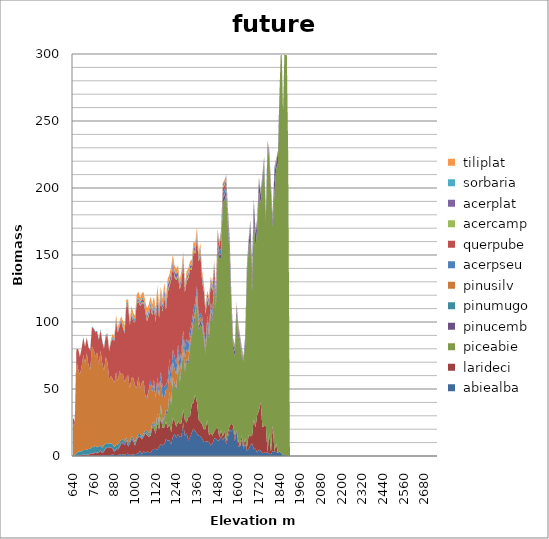
| Category |  abiealba |  larideci |  piceabie |  pinucemb |  pinumugo |  pinusilv |  acerpseu |  querpube |  acercamp |  acerplat |  sorbaria |  tiliplat |
|---|---|---|---|---|---|---|---|---|---|---|---|---|
| 640.0 | 0 | 0 | 0 | 0 | 0.323 | 23.474 | 0 | 4.704 | 0 | 0 | 0 | 0 |
| 650.0 | 0 | 0 | 0 | 0 | 0.431 | 22.198 | 0 | 3.252 | 0 | 0 | 0 | 0 |
| 660.0 | 0 | 0.091 | 0 | 0 | 2.044 | 68.238 | 0 | 9.557 | 0 | 0 | 0.005 | 0 |
| 670.0 | 0.007 | 0.401 | 0 | 0.013 | 2.715 | 61.76 | 0 | 14.93 | 0.001 | 0 | 0.104 | 0 |
| 680.0 | 0.008 | 0.586 | 0 | 0.011 | 2.964 | 57.024 | 0 | 13.486 | 0 | 0 | 0.146 | 0 |
| 690.0 | 0.024 | 0.575 | 0 | 0.051 | 2.938 | 63.038 | 0 | 13.546 | 0 | 0 | 0.21 | 0 |
| 700.0 | 0.081 | 1.008 | 0 | 0.126 | 3.188 | 70.913 | 0 | 12.954 | 0 | 0 | 0.324 | 0.002 |
| 710.0 | 0.063 | 0.841 | 0 | 0.088 | 3.44 | 64.424 | 0 | 12.69 | 0 | 0 | 0.267 | 0 |
| 720.0 | 0.097 | 0.638 | 0 | 0.147 | 4.031 | 72.02 | 0 | 11.426 | 0.001 | 0 | 0.41 | 0 |
| 730.0 | 0.155 | 0.925 | 0 | 0.208 | 3.935 | 62.399 | 0 | 13.411 | 0 | 0.001 | 0.425 | 0.001 |
| 740.0 | 0.179 | 1.336 | 0 | 0.22 | 3.732 | 58.757 | 0 | 14.437 | 0 | 0.001 | 0.518 | 0.002 |
| 750.0 | 0.218 | 1.769 | 0 | 0.275 | 4.629 | 74.861 | 0 | 14.465 | 0 | 0 | 0.627 | 0.001 |
| 760.0 | 0.19 | 1.498 | 0 | 0.24 | 4.589 | 72.752 | 0 | 15.649 | 0.003 | 0.001 | 0.628 | 0.006 |
| 770.0 | 0.209 | 2.584 | 0 | 0.352 | 4.723 | 66.568 | 0 | 17.869 | 0.004 | 0.006 | 0.701 | 0.013 |
| 780.0 | 0.218 | 1.824 | 0 | 0.276 | 4.208 | 70.791 | 0 | 15.324 | 0.004 | 0.002 | 0.747 | 0.008 |
| 790.0 | 0.212 | 2.452 | 0 | 0.357 | 3.902 | 61.228 | 0 | 18.566 | 0.009 | 0.007 | 0.742 | 0.017 |
| 800.0 | 0.259 | 3.532 | 0 | 0.337 | 4.083 | 70.594 | 0 | 15.005 | 0.01 | 0.011 | 0.926 | 0.024 |
| 810.0 | 0.223 | 1.793 | 0 | 0.362 | 3.763 | 63.028 | 0 | 16.107 | 0.013 | 0.008 | 0.983 | 0.041 |
| 820.0 | 0.506 | 2.865 | 0 | 0.592 | 4.208 | 55.599 | 0 | 16.298 | 0.031 | 0.035 | 1.099 | 0.133 |
| 830.0 | 0.615 | 4.883 | 0 | 0.554 | 3.256 | 64.451 | 0 | 15.319 | 0.079 | 0.046 | 1.099 | 0.333 |
| 840.0 | 0.694 | 5.426 | 0 | 0.615 | 2.901 | 60.718 | 0 | 19.197 | 0.112 | 0.281 | 1.047 | 0.896 |
| 850.0 | 0.44 | 5.392 | 0 | 0.465 | 3.051 | 47.9 | 0 | 20.957 | 0.098 | 0.137 | 0.937 | 1.097 |
| 860.0 | 0.75 | 5.623 | 0 | 0.42 | 2.735 | 50.194 | 0 | 25.283 | 0.095 | 0.131 | 0.819 | 0.897 |
| 870.0 | 1.096 | 4.146 | 0 | 0.543 | 3.027 | 48.718 | 0 | 29.504 | 0.155 | 0.312 | 0.954 | 2.708 |
| 880.0 | 0.753 | 1.978 | 0 | 0.686 | 3.399 | 47.326 | 0 | 31.762 | 0.224 | 0.28 | 0.98 | 1.522 |
| 890.0 | 0.739 | 4.156 | 0 | 0.564 | 2.822 | 54.316 | 0 | 38.095 | 0.272 | 0.435 | 1 | 2.904 |
| 900.0 | 0.738 | 3.595 | 0 | 0.766 | 3.273 | 46.996 | 0 | 36.69 | 0.24 | 0.356 | 1.128 | 2.381 |
| 910.0 | 0.978 | 5.573 | 0 | 0.862 | 2.527 | 53.757 | 0 | 33.021 | 0.326 | 0.705 | 1.02 | 1.631 |
| 920.0 | 1.465 | 7.644 | 0 | 0.814 | 2.751 | 47.793 | 0 | 40.315 | 0.345 | 0.379 | 0.922 | 1.769 |
| 930.0 | 1.205 | 8.202 | 0 | 0.739 | 2.228 | 49.168 | 0 | 33.975 | 0.437 | 0.518 | 0.91 | 3.611 |
| 940.0 | 0.782 | 7.105 | 0.001 | 0.655 | 2.195 | 44.241 | 0 | 36.593 | 0.445 | 0.618 | 1.107 | 3.758 |
| 950.0 | 1.537 | 9.784 | 0.001 | 0.581 | 1.835 | 44.756 | 0 | 53.761 | 0.378 | 0.59 | 0.923 | 2.426 |
| 960.0 | 1.667 | 5.387 | 0.004 | 0.685 | 2.001 | 50.97 | 0.002 | 50.364 | 0.556 | 1.456 | 1.062 | 2.83 |
| 970.0 | 0.8 | 8.032 | 0.001 | 0.649 | 1.742 | 39.252 | 0.003 | 47.322 | 0.358 | 0.635 | 0.923 | 1.785 |
| 980.0 | 0.913 | 11.56 | 0.008 | 0.526 | 1.609 | 43.868 | 0.001 | 46.557 | 0.45 | 1.113 | 1.081 | 4.28 |
| 990.0 | 1.064 | 9.778 | 0.021 | 0.764 | 1.615 | 45.234 | 0.007 | 41.951 | 0.585 | 1.301 | 1.129 | 3.377 |
| 1000.0 | 1.574 | 5.988 | 0.029 | 0.535 | 2.134 | 42.462 | 0.014 | 46.697 | 0.611 | 1.09 | 1.225 | 2.454 |
| 1010.0 | 1.586 | 10.28 | 0.093 | 0.509 | 1.529 | 36.511 | 0.607 | 62.495 | 0.608 | 1.396 | 1.193 | 3.654 |
| 1020.0 | 1.821 | 12.059 | 0.064 | 0.652 | 1.773 | 42.887 | 0.024 | 55.892 | 0.729 | 1.315 | 1.056 | 4.228 |
| 1030.0 | 3.973 | 10.204 | 0.053 | 0.576 | 1.685 | 33.852 | 0.015 | 61.623 | 0.744 | 1.328 | 1.046 | 3.205 |
| 1040.0 | 1.362 | 11.02 | 0.111 | 0.592 | 1.28 | 40.237 | 0.21 | 59.01 | 0.792 | 2.415 | 0.846 | 3.755 |
| 1050.0 | 3.606 | 10.792 | 0.176 | 0.748 | 1.336 | 39.569 | 0.277 | 57.58 | 0.946 | 1.759 | 1.045 | 4.477 |
| 1060.0 | 2.332 | 14.528 | 0.475 | 0.749 | 1.352 | 25.08 | 0.605 | 62.758 | 0.905 | 1.925 | 1.02 | 3.364 |
| 1070.0 | 3.155 | 12.326 | 0.837 | 0.818 | 1.38 | 24.459 | 0.83 | 56.685 | 1.541 | 2.038 | 1.191 | 4.934 |
| 1080.0 | 3.156 | 11.184 | 0.517 | 0.649 | 1.363 | 31.981 | 0.851 | 54.86 | 1.04 | 1.869 | 1.045 | 4.545 |
| 1090.0 | 1.95 | 13.044 | 1.361 | 0.703 | 1.634 | 34.397 | 3.434 | 54.333 | 0.979 | 1.878 | 0.962 | 4.298 |
| 1100.0 | 4.297 | 16.613 | 0.597 | 0.989 | 1.284 | 24.078 | 2.326 | 54.881 | 1.227 | 1.921 | 1.153 | 3.763 |
| 1110.0 | 5.182 | 15.444 | 2.712 | 0.861 | 1.327 | 28.056 | 3.505 | 53.942 | 1.049 | 1.654 | 1.081 | 4.26 |
| 1120.0 | 5.399 | 11.276 | 3.337 | 0.958 | 1.174 | 21.381 | 1.266 | 55.495 | 1.358 | 3.18 | 1.099 | 4.22 |
| 1130.0 | 4.362 | 20.104 | 5.096 | 1.081 | 1.145 | 23.273 | 3.436 | 57.971 | 1.332 | 3.227 | 1.166 | 4.762 |
| 1140.0 | 7.014 | 12.767 | 3.511 | 1.04 | 1.188 | 19.014 | 5.152 | 53.414 | 1.576 | 2.892 | 1.183 | 4.3 |
| 1150.0 | 8.852 | 20.089 | 7.615 | 1.286 | 0.717 | 18.33 | 6.081 | 54.686 | 1.183 | 2.45 | 1.097 | 3.928 |
| 1160.0 | 7.766 | 13.202 | 2.801 | 1.121 | 0.943 | 18.153 | 7.493 | 55.887 | 1.519 | 2.715 | 1.135 | 4.26 |
| 1170.0 | 8.846 | 12.358 | 5.959 | 1.194 | 0.744 | 14.851 | 7.506 | 67.653 | 1.536 | 3.573 | 0.832 | 4.447 |
| 1180.0 | 12.516 | 13.406 | 6.285 | 1.512 | 0.835 | 14.784 | 3.849 | 55.922 | 1.444 | 2.891 | 1.016 | 4.064 |
| 1190.0 | 11.462 | 9.399 | 10.307 | 1.625 | 0.694 | 16.229 | 6.099 | 66.28 | 1.47 | 3.95 | 0.858 | 3.979 |
| 1200.0 | 11.69 | 11.895 | 22.66 | 1.06 | 0.506 | 16.272 | 8.28 | 54.254 | 1.176 | 2.89 | 0.817 | 3.97 |
| 1210.0 | 8.666 | 9.273 | 19.818 | 0.994 | 0.454 | 13.743 | 8.036 | 70.429 | 1.439 | 3.336 | 0.851 | 4.207 |
| 1220.0 | 14.378 | 14.035 | 28.269 | 1.411 | 0.65 | 11.659 | 9.005 | 62.154 | 1.314 | 2.673 | 0.726 | 4.013 |
| 1230.0 | 16.779 | 9.446 | 26.295 | 1.293 | 0.767 | 10.452 | 9.492 | 58.804 | 1.21 | 3.018 | 0.579 | 3.701 |
| 1240.0 | 13.511 | 8.164 | 26.994 | 1.336 | 0.695 | 10.001 | 7.579 | 63.016 | 1.365 | 2.863 | 0.634 | 3.847 |
| 1250.0 | 16.356 | 9.53 | 41.784 | 1.461 | 0.481 | 7.821 | 5.872 | 50.251 | 1.344 | 2.631 | 0.64 | 3.965 |
| 1260.0 | 14.26 | 9.971 | 29.304 | 1.683 | 0.659 | 6.681 | 8.553 | 53.282 | 1.094 | 2.215 | 0.569 | 3.238 |
| 1270.0 | 14.68 | 9.846 | 40.651 | 1.658 | 0.318 | 6.051 | 6.066 | 50.492 | 1.512 | 2.452 | 0.543 | 3.682 |
| 1280.0 | 24.811 | 9.979 | 43.539 | 1.703 | 0.337 | 7.635 | 5.813 | 52.065 | 1.211 | 2.04 | 0.497 | 2.847 |
| 1290.0 | 14.887 | 12.02 | 35.547 | 2.138 | 0.532 | 8.331 | 7.319 | 41.581 | 1.229 | 1.665 | 0.812 | 3.079 |
| 1300.0 | 16.874 | 7.966 | 45.03 | 1.586 | 0.541 | 7.312 | 7.998 | 42.89 | 1.631 | 1.997 | 0.572 | 3.415 |
| 1310.0 | 11.408 | 17.808 | 40.353 | 1.372 | 0.575 | 6.35 | 6.025 | 48.931 | 1.51 | 1.784 | 0.691 | 3.301 |
| 1320.0 | 14.173 | 15.661 | 51.53 | 1.639 | 0.444 | 4.364 | 5.966 | 45.04 | 1.262 | 1.679 | 0.647 | 2.974 |
| 1330.0 | 17.5 | 21.174 | 50.159 | 2.401 | 0.593 | 3.323 | 4.524 | 39.31 | 1.656 | 1.879 | 0.824 | 3.124 |
| 1340.0 | 20.686 | 19.097 | 57.626 | 2.625 | 0.392 | 3.109 | 5.998 | 42.917 | 1.663 | 1.875 | 0.631 | 3.529 |
| 1350.0 | 18.519 | 27.475 | 56.379 | 2.75 | 0.521 | 2.654 | 6.397 | 36.216 | 1.76 | 2.121 | 0.798 | 3.334 |
| 1360.0 | 16.733 | 23.336 | 75.129 | 2.238 | 0.324 | 4.91 | 4.167 | 36.176 | 1.769 | 1.961 | 0.799 | 3.275 |
| 1370.0 | 15.18 | 11.912 | 66.544 | 2.916 | 0.792 | 3.647 | 3.183 | 40.852 | 1.644 | 1.706 | 0.622 | 2.8 |
| 1380.0 | 14.885 | 10.531 | 72.604 | 2.496 | 0.546 | 2.798 | 2.715 | 44.215 | 1.773 | 1.969 | 0.802 | 3.427 |
| 1390.0 | 12.93 | 10.633 | 72.085 | 2.136 | 0.528 | 2.309 | 3.441 | 26.266 | 1.877 | 2.085 | 0.747 | 3.139 |
| 1400.0 | 10.307 | 9.721 | 65.71 | 2.414 | 0.632 | 2.224 | 3.064 | 28.9 | 1.6 | 1.567 | 0.503 | 1.891 |
| 1410.0 | 10.638 | 9.325 | 55.422 | 2.082 | 0.377 | 2.989 | 3.332 | 21.731 | 1.868 | 2.004 | 0.728 | 2.326 |
| 1420.0 | 11.014 | 16.328 | 69.902 | 2.541 | 0.42 | 1.661 | 2.858 | 12.374 | 1.861 | 2.126 | 0.504 | 1.842 |
| 1430.0 | 10.295 | 5.005 | 72.313 | 2.121 | 0.371 | 3.063 | 3.453 | 15.155 | 2.04 | 2.266 | 0.581 | 1.887 |
| 1440.0 | 7.765 | 9.51 | 89.45 | 2.226 | 0.348 | 1.49 | 3.701 | 13.92 | 1.636 | 1.915 | 0.443 | 1.518 |
| 1450.0 | 9.471 | 5.694 | 85.581 | 3.234 | 0.151 | 0.748 | 3.684 | 14.822 | 1.77 | 1.815 | 0.479 | 1.379 |
| 1460.0 | 13.136 | 5.122 | 107.293 | 3.308 | 0.101 | 0.307 | 4.015 | 8.25 | 1.177 | 1.498 | 0.281 | 0.933 |
| 1470.0 | 13.166 | 7.253 | 88.802 | 3.716 | 0.094 | 0.481 | 3.615 | 4.573 | 1.237 | 1.342 | 0.235 | 0.931 |
| 1480.0 | 11.446 | 9.808 | 131.677 | 3.3 | 0.187 | 0.765 | 2.345 | 6.263 | 0.976 | 1.093 | 0.272 | 0.716 |
| 1490.0 | 11.832 | 2.155 | 133.683 | 2.014 | 0.275 | 0.842 | 2.198 | 3.67 | 1.35 | 1.247 | 0.255 | 0.935 |
| 1500.0 | 14.943 | 4.288 | 128.412 | 2.564 | 0.187 | 0.281 | 4.3 | 9.535 | 1.516 | 1.482 | 0.287 | 0.996 |
| 1510.0 | 11.654 | 2.896 | 175.054 | 2.721 | 0.121 | 0.3 | 3.531 | 3.612 | 1.348 | 1.467 | 0.204 | 1.025 |
| 1520.0 | 14.606 | 3.917 | 172.26 | 3.766 | 0.121 | 0.737 | 3.43 | 3.304 | 1.331 | 1.442 | 0.241 | 0.9 |
| 1530.0 | 8.651 | 2.418 | 184.322 | 3.573 | 0.069 | 0.775 | 3.558 | 2.737 | 1.445 | 1.424 | 0.261 | 0.801 |
| 1540.0 | 14.015 | 3.514 | 152.553 | 3.369 | 0.091 | 0.317 | 3.685 | 2.867 | 1.41 | 1.487 | 0.359 | 0.745 |
| 1550.0 | 20.302 | 2.559 | 126.029 | 6.182 | 0.135 | 0.406 | 2.597 | 1.952 | 1.219 | 1.185 | 0.243 | 0.512 |
| 1560.0 | 18.204 | 5.826 | 84.824 | 5.446 | 0.124 | 0.273 | 2.1 | 1.56 | 0.519 | 0.613 | 0.09 | 0.246 |
| 1570.0 | 20.702 | 2.138 | 57.325 | 3.3 | 0.097 | 0.851 | 1.072 | 1.075 | 0.556 | 0.478 | 0.172 | 0.252 |
| 1580.0 | 10.944 | 4.038 | 59.452 | 3.451 | 0.404 | 0.7 | 1.608 | 1.053 | 0.568 | 0.609 | 0.227 | 0.26 |
| 1590.0 | 18.75 | 0.487 | 86.712 | 3.394 | 0.304 | 0.63 | 1.222 | 1.488 | 0.735 | 0.685 | 0.262 | 0.283 |
| 1600.0 | 7.212 | 4.11 | 78.188 | 3.125 | 0.472 | 1.579 | 1.417 | 1.428 | 0.675 | 0.535 | 0.147 | 0.229 |
| 1610.0 | 7.022 | 0.281 | 77.177 | 2.159 | 0.113 | 0.143 | 1.149 | 0.635 | 0.667 | 0.712 | 0.105 | 0.146 |
| 1620.0 | 12.028 | 3.727 | 58.076 | 1.998 | 0.432 | 1.351 | 0.798 | 1.559 | 0.866 | 0.662 | 0.225 | 0.15 |
| 1630.0 | 5.277 | 1.341 | 63.756 | 1.146 | 0.095 | 0.333 | 0.788 | 0.338 | 0.498 | 0.468 | 0.037 | 0.1 |
| 1640.0 | 9.205 | 4.22 | 69.89 | 4.049 | 0.126 | 0.157 | 1.162 | 0.309 | 0.27 | 0.324 | 0.094 | 0.01 |
| 1650.0 | 3.965 | 2.12 | 129.335 | 3.238 | 0.084 | 0.319 | 1.038 | 0.747 | 0.563 | 0.472 | 0.112 | 0.026 |
| 1660.0 | 5.103 | 10.351 | 138.436 | 3.718 | 0.075 | 0.336 | 1.13 | 0.966 | 0.579 | 0.64 | 0.088 | 0.047 |
| 1670.0 | 7.801 | 6.99 | 146.27 | 11.245 | 0 | 0 | 1.853 | 0.592 | 0.788 | 0.609 | 0.088 | 0 |
| 1680.0 | 9.52 | 5.352 | 107.072 | 12.282 | 0.333 | 0.475 | 1.556 | 1.288 | 0.828 | 0.611 | 0.179 | 0 |
| 1690.0 | 5.242 | 22.341 | 150.632 | 10.609 | 0.068 | 0.126 | 1.231 | 0.543 | 0.641 | 0.68 | 0.074 | 0 |
| 1700.0 | 5.425 | 15.918 | 133.68 | 10.494 | 0.099 | 0.19 | 1.556 | 0.654 | 0.589 | 0.57 | 0.134 | 0 |
| 1710.0 | 2.421 | 28.216 | 139.901 | 3.584 | 0.131 | 0.031 | 0.864 | 1.083 | 0.459 | 0.427 | 0.119 | 0 |
| 1720.0 | 4.704 | 29.165 | 163.567 | 7.532 | 0.131 | 0.212 | 1.225 | 0.551 | 0.535 | 0.523 | 0.069 | 0 |
| 1730.0 | 4.076 | 36.159 | 148.324 | 6.468 | 0.274 | 0.472 | 0.588 | 0.41 | 0.402 | 0.331 | 0.137 | 0 |
| 1740.0 | 2.029 | 19.52 | 182.951 | 1.684 | 0.332 | 0.196 | 1.108 | 1.103 | 0.458 | 0.564 | 0.249 | 0 |
| 1750.0 | 2.485 | 19.92 | 196.056 | 2.188 | 0.052 | 0.233 | 1.016 | 0.316 | 0.436 | 0.386 | 0.09 | 0 |
| 1760.0 | 2.352 | 20.186 | 151.971 | 3.733 | 0.154 | 0.171 | 1.676 | 0.959 | 0.474 | 0.294 | 0.23 | 0 |
| 1770.0 | 2.652 | 0 | 227.296 | 1.219 | 0 | 0 | 2.684 | 0.666 | 0.481 | 0.214 | 0 | 0 |
| 1780.0 | 1.731 | 15.781 | 205.037 | 1.821 | 0 | 0.805 | 0.565 | 1.541 | 0.493 | 0.332 | 0.33 | 0 |
| 1790.0 | 1.281 | 1.415 | 192.78 | 1.16 | 0.787 | 1.015 | 0.789 | 1.955 | 0.613 | 0.531 | 0.355 | 0 |
| 1800.0 | 3.857 | 19.601 | 147.092 | 4.005 | 0.68 | 0.538 | 1.706 | 0.966 | 0.802 | 0.437 | 0.424 | 0 |
| 1810.0 | 3.432 | 0 | 193.019 | 15.323 | 0 | 0 | 3.123 | 0 | 0.564 | 0.512 | 0.064 | 0 |
| 1820.0 | 2.994 | 6.219 | 205.147 | 3.889 | 0.378 | 1.12 | 0.789 | 0.595 | 0.235 | 0.141 | 0.149 | 0 |
| 1830.0 | 2.386 | 0 | 215.943 | 8.42 | 0 | 0 | 0.794 | 0 | 0.212 | 0 | 0 | 0 |
| 1840.0 | 3.334 | 0 | 269.876 | 0.953 | 0 | 0 | 0.277 | 0 | 0 | 0 | 0 | 0 |
| 1850.0 | 2.194 | 0 | 311.595 | 0.07 | 0 | 0 | 0.69 | 0 | 0 | 0 | 0 | 0 |
| 1860.0 | 0.278 | 0 | 255.665 | 0.15 | 0 | 0 | 0.391 | 0 | 0 | 0.138 | 0 | 0 |
| 1870.0 | 0.907 | 0 | 312.585 | 0 | 0 | 0 | 0.145 | 0 | 0 | 0 | 0 | 0 |
| 1880.0 | 0 | 0 | 319.663 | 0 | 0 | 0 | 0 | 0 | 0 | 0 | 0 | 0 |
| 1890.0 | 0 | 0 | 224.125 | 0 | 0 | 0 | 0 | 0 | 0 | 0 | 0 | 0 |
| 1900.0 | 0 | 0 | 0 | 0 | 0 | 0 | 0 | 0 | 0 | 0 | 0 | 0 |
| 1910.0 | 0 | 0 | 0 | 0 | 0 | 0 | 0 | 0 | 0 | 0 | 0 | 0 |
| 1920.0 | 0 | 0 | 0 | 0 | 0 | 0 | 0 | 0 | 0 | 0 | 0 | 0 |
| 1930.0 | 0 | 0 | 0 | 0 | 0 | 0 | 0 | 0 | 0 | 0 | 0 | 0 |
| 1940.0 | 0 | 0 | 0 | 0 | 0 | 0 | 0 | 0 | 0 | 0 | 0 | 0 |
| 1950.0 | 0 | 0 | 0 | 0 | 0 | 0 | 0 | 0 | 0 | 0 | 0 | 0 |
| 1960.0 | 0 | 0 | 0 | 0 | 0 | 0 | 0 | 0 | 0 | 0 | 0 | 0 |
| 1970.0 | 0 | 0 | 0 | 0 | 0 | 0 | 0 | 0 | 0 | 0 | 0 | 0 |
| 1980.0 | 0 | 0 | 0 | 0 | 0 | 0 | 0 | 0 | 0 | 0 | 0 | 0 |
| 1990.0 | 0 | 0 | 0 | 0 | 0 | 0 | 0 | 0 | 0 | 0 | 0 | 0 |
| 2000.0 | 0 | 0 | 0 | 0 | 0 | 0 | 0 | 0 | 0 | 0 | 0 | 0 |
| 2010.0 | 0 | 0 | 0 | 0 | 0 | 0 | 0 | 0 | 0 | 0 | 0 | 0 |
| 2020.0 | 0 | 0 | 0 | 0 | 0 | 0 | 0 | 0 | 0 | 0 | 0 | 0 |
| 2030.0 | 0 | 0 | 0 | 0 | 0 | 0 | 0 | 0 | 0 | 0 | 0 | 0 |
| 2040.0 | 0 | 0 | 0 | 0 | 0 | 0 | 0 | 0 | 0 | 0 | 0 | 0 |
| 2050.0 | 0 | 0 | 0 | 0 | 0 | 0 | 0 | 0 | 0 | 0 | 0 | 0 |
| 2060.0 | 0 | 0 | 0 | 0 | 0 | 0 | 0 | 0 | 0 | 0 | 0 | 0 |
| 2070.0 | 0 | 0 | 0 | 0 | 0 | 0 | 0 | 0 | 0 | 0 | 0 | 0 |
| 2080.0 | 0 | 0 | 0 | 0 | 0 | 0 | 0 | 0 | 0 | 0 | 0 | 0 |
| 2090.0 | 0 | 0 | 0 | 0 | 0 | 0 | 0 | 0 | 0 | 0 | 0 | 0 |
| 2100.0 | 0 | 0 | 0 | 0 | 0 | 0 | 0 | 0 | 0 | 0 | 0 | 0 |
| 2110.0 | 0 | 0 | 0 | 0 | 0 | 0 | 0 | 0 | 0 | 0 | 0 | 0 |
| 2120.0 | 0 | 0 | 0 | 0 | 0 | 0 | 0 | 0 | 0 | 0 | 0 | 0 |
| 2130.0 | 0 | 0 | 0 | 0 | 0 | 0 | 0 | 0 | 0 | 0 | 0 | 0 |
| 2140.0 | 0 | 0 | 0 | 0 | 0 | 0 | 0 | 0 | 0 | 0 | 0 | 0 |
| 2150.0 | 0 | 0 | 0 | 0 | 0 | 0 | 0 | 0 | 0 | 0 | 0 | 0 |
| 2160.0 | 0 | 0 | 0 | 0 | 0 | 0 | 0 | 0 | 0 | 0 | 0 | 0 |
| 2170.0 | 0 | 0 | 0 | 0 | 0 | 0 | 0 | 0 | 0 | 0 | 0 | 0 |
| 2180.0 | 0 | 0 | 0 | 0 | 0 | 0 | 0 | 0 | 0 | 0 | 0 | 0 |
| 2190.0 | 0 | 0 | 0 | 0 | 0 | 0 | 0 | 0 | 0 | 0 | 0 | 0 |
| 2200.0 | 0 | 0 | 0 | 0 | 0 | 0 | 0 | 0 | 0 | 0 | 0 | 0 |
| 2210.0 | 0 | 0 | 0 | 0 | 0 | 0 | 0 | 0 | 0 | 0 | 0 | 0 |
| 2220.0 | 0 | 0 | 0 | 0 | 0 | 0 | 0 | 0 | 0 | 0 | 0 | 0 |
| 2230.0 | 0 | 0 | 0 | 0 | 0 | 0 | 0 | 0 | 0 | 0 | 0 | 0 |
| 2240.0 | 0 | 0 | 0 | 0 | 0 | 0 | 0 | 0 | 0 | 0 | 0 | 0 |
| 2250.0 | 0 | 0 | 0 | 0 | 0 | 0 | 0 | 0 | 0 | 0 | 0 | 0 |
| 2260.0 | 0 | 0 | 0 | 0 | 0 | 0 | 0 | 0 | 0 | 0 | 0 | 0 |
| 2270.0 | 0 | 0 | 0 | 0 | 0 | 0 | 0 | 0 | 0 | 0 | 0 | 0 |
| 2280.0 | 0 | 0 | 0 | 0 | 0 | 0 | 0 | 0 | 0 | 0 | 0 | 0 |
| 2290.0 | 0 | 0 | 0 | 0 | 0 | 0 | 0 | 0 | 0 | 0 | 0 | 0 |
| 2300.0 | 0 | 0 | 0 | 0 | 0 | 0 | 0 | 0 | 0 | 0 | 0 | 0 |
| 2310.0 | 0 | 0 | 0 | 0 | 0 | 0 | 0 | 0 | 0 | 0 | 0 | 0 |
| 2320.0 | 0 | 0 | 0 | 0 | 0 | 0 | 0 | 0 | 0 | 0 | 0 | 0 |
| 2330.0 | 0 | 0 | 0 | 0 | 0 | 0 | 0 | 0 | 0 | 0 | 0 | 0 |
| 2340.0 | 0 | 0 | 0 | 0 | 0 | 0 | 0 | 0 | 0 | 0 | 0 | 0 |
| 2350.0 | 0 | 0 | 0 | 0 | 0 | 0 | 0 | 0 | 0 | 0 | 0 | 0 |
| 2360.0 | 0 | 0 | 0 | 0 | 0 | 0 | 0 | 0 | 0 | 0 | 0 | 0 |
| 2370.0 | 0 | 0 | 0 | 0 | 0 | 0 | 0 | 0 | 0 | 0 | 0 | 0 |
| 2380.0 | 0 | 0 | 0 | 0 | 0 | 0 | 0 | 0 | 0 | 0 | 0 | 0 |
| 2390.0 | 0 | 0 | 0 | 0 | 0 | 0 | 0 | 0 | 0 | 0 | 0 | 0 |
| 2400.0 | 0 | 0 | 0 | 0 | 0 | 0 | 0 | 0 | 0 | 0 | 0 | 0 |
| 2410.0 | 0 | 0 | 0 | 0 | 0 | 0 | 0 | 0 | 0 | 0 | 0 | 0 |
| 2420.0 | 0 | 0 | 0 | 0 | 0 | 0 | 0 | 0 | 0 | 0 | 0 | 0 |
| 2430.0 | 0 | 0 | 0 | 0 | 0 | 0 | 0 | 0 | 0 | 0 | 0 | 0 |
| 2440.0 | 0 | 0 | 0 | 0 | 0 | 0 | 0 | 0 | 0 | 0 | 0 | 0 |
| 2450.0 | 0 | 0 | 0 | 0 | 0 | 0 | 0 | 0 | 0 | 0 | 0 | 0 |
| 2460.0 | 0 | 0 | 0 | 0 | 0 | 0 | 0 | 0 | 0 | 0 | 0 | 0 |
| 2470.0 | 0 | 0 | 0 | 0 | 0 | 0 | 0 | 0 | 0 | 0 | 0 | 0 |
| 2480.0 | 0 | 0 | 0 | 0 | 0 | 0 | 0 | 0 | 0 | 0 | 0 | 0 |
| 2490.0 | 0 | 0 | 0 | 0 | 0 | 0 | 0 | 0 | 0 | 0 | 0 | 0 |
| 2500.0 | 0 | 0 | 0 | 0 | 0 | 0 | 0 | 0 | 0 | 0 | 0 | 0 |
| 2510.0 | 0 | 0 | 0 | 0 | 0 | 0 | 0 | 0 | 0 | 0 | 0 | 0 |
| 2520.0 | 0 | 0 | 0 | 0 | 0 | 0 | 0 | 0 | 0 | 0 | 0 | 0 |
| 2530.0 | 0 | 0 | 0 | 0 | 0 | 0 | 0 | 0 | 0 | 0 | 0 | 0 |
| 2540.0 | 0 | 0 | 0 | 0 | 0 | 0 | 0 | 0 | 0 | 0 | 0 | 0 |
| 2550.0 | 0 | 0 | 0 | 0 | 0 | 0 | 0 | 0 | 0 | 0 | 0 | 0 |
| 2560.0 | 0 | 0 | 0 | 0 | 0 | 0 | 0 | 0 | 0 | 0 | 0 | 0 |
| 2570.0 | 0 | 0 | 0 | 0 | 0 | 0 | 0 | 0 | 0 | 0 | 0 | 0 |
| 2580.0 | 0 | 0 | 0 | 0 | 0 | 0 | 0 | 0 | 0 | 0 | 0 | 0 |
| 2590.0 | 0 | 0 | 0 | 0 | 0 | 0 | 0 | 0 | 0 | 0 | 0 | 0 |
| 2600.0 | 0 | 0 | 0 | 0 | 0 | 0 | 0 | 0 | 0 | 0 | 0 | 0 |
| 2610.0 | 0 | 0 | 0 | 0 | 0 | 0 | 0 | 0 | 0 | 0 | 0 | 0 |
| 2620.0 | 0 | 0 | 0 | 0 | 0 | 0 | 0 | 0 | 0 | 0 | 0 | 0 |
| 2630.0 | 0 | 0 | 0 | 0 | 0 | 0 | 0 | 0 | 0 | 0 | 0 | 0 |
| 2640.0 | 0 | 0 | 0 | 0 | 0 | 0 | 0 | 0 | 0 | 0 | 0 | 0 |
| 2650.0 | 0 | 0 | 0 | 0 | 0 | 0 | 0 | 0 | 0 | 0 | 0 | 0 |
| 2660.0 | 0 | 0 | 0 | 0 | 0 | 0 | 0 | 0 | 0 | 0 | 0 | 0 |
| 2670.0 | 0 | 0 | 0 | 0 | 0 | 0 | 0 | 0 | 0 | 0 | 0 | 0 |
| 2680.0 | 0 | 0 | 0 | 0 | 0 | 0 | 0 | 0 | 0 | 0 | 0 | 0 |
| 2690.0 | 0 | 0 | 0 | 0 | 0 | 0 | 0 | 0 | 0 | 0 | 0 | 0 |
| 2700.0 | 0 | 0 | 0 | 0 | 0 | 0 | 0 | 0 | 0 | 0 | 0 | 0 |
| 2710.0 | 0 | 0 | 0 | 0 | 0 | 0 | 0 | 0 | 0 | 0 | 0 | 0 |
| 2720.0 | 0 | 0 | 0 | 0 | 0 | 0 | 0 | 0 | 0 | 0 | 0 | 0 |
| 2730.0 | 0 | 0 | 0 | 0 | 0 | 0 | 0 | 0 | 0 | 0 | 0 | 0 |
| 2740.0 | 0 | 0 | 0 | 0 | 0 | 0 | 0 | 0 | 0 | 0 | 0 | 0 |
| 2750.0 | 0 | 0 | 0 | 0 | 0 | 0 | 0 | 0 | 0 | 0 | 0 | 0 |